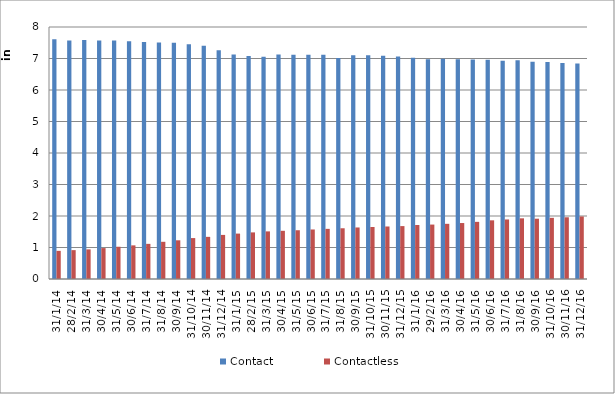
| Category | Contact | Contactless |
|---|---|---|
| 2014-01-31 | 7607525 | 893696 |
| 2014-02-28 | 7572234 | 916276 |
| 2014-03-31 | 7590263 | 940110 |
| 2014-04-30 | 7572989 | 981698 |
| 2014-05-31 | 7573909 | 1023990 |
| 2014-06-30 | 7549755 | 1067545 |
| 2014-07-31 | 7521469 | 1115589 |
| 2014-08-31 | 7510947 | 1180752 |
| 2014-09-30 | 7503512 | 1228624 |
| 2014-10-31 | 7454356 | 1299146 |
| 2014-11-30 | 7407420 | 1338108 |
| 2014-12-31 | 7260298 | 1399732 |
| 2015-01-31 | 7129150 | 1441434 |
| 2015-02-28 | 7082417 | 1479374 |
| 2015-03-31 | 7053142 | 1511330 |
| 2015-04-30 | 7126252 | 1529942 |
| 2015-05-31 | 7118286 | 1547834 |
| 2015-06-30 | 7120959 | 1572061 |
| 2015-07-31 | 7121885 | 1591850 |
| 2015-08-31 | 7014148 | 1610587 |
| 2015-09-30 | 7099818 | 1635957 |
| 2015-10-31 | 7103946 | 1650752 |
| 2015-11-30 | 7088873 | 1667219 |
| 2015-12-31 | 7059590 | 1679403 |
| 2016-01-31 | 7027213 | 1714950 |
| 2016-02-29 | 6975506 | 1727887 |
| 2016-03-31 | 6989930 | 1751512 |
| 2016-04-30 | 6979564 | 1776886 |
| 2016-05-31 | 6966648 | 1814233 |
| 2016-06-30 | 6959395 | 1862700 |
| 2016-07-31 | 6927310 | 1889925 |
| 2016-08-31 | 6941145 | 1926289 |
| 2016-09-30 | 6897213 | 1914070 |
| 2016-10-31 | 6887436 | 1941595 |
| 2016-11-30 | 6859426 | 1959545 |
| 2016-12-31 | 6837748 | 1985072 |